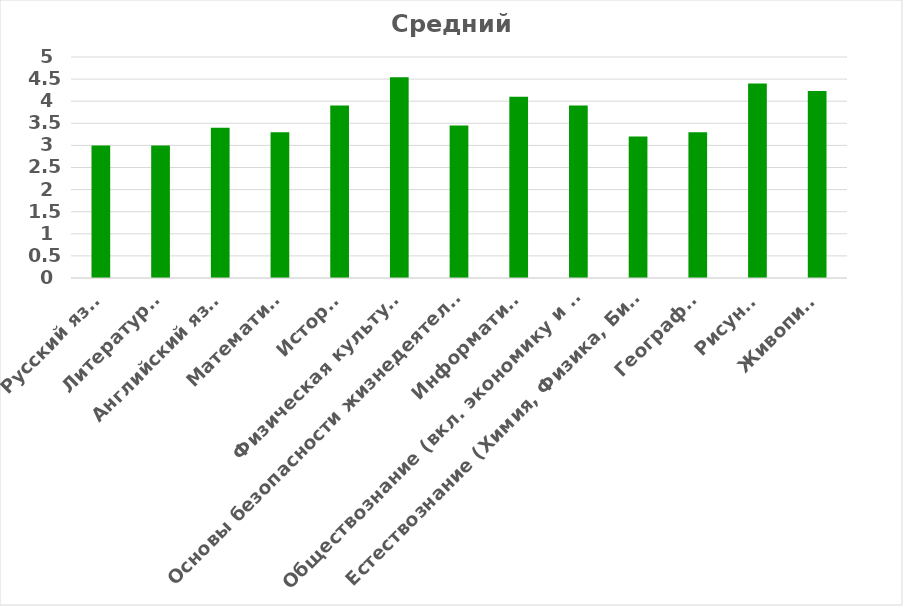
| Category | Средний балл |
|---|---|
|  Русский язык  | 3 |
| Литература  | 3 |
| Английский язык | 3.4 |
| Математика | 3.3 |
|  История | 3.9 |
| Физическая культура  | 4.54 |
| Основы безопасности жизнедеятельности (включая экологию) | 3.45 |
| Информатика | 4.1 |
| Обществознание (вкл. экономику и право) | 3.9 |
| Естествознание (Химия, Физика, Биология) | 3.2 |
| География | 3.3 |
|  Рисунок | 4.4 |
| Живопись | 4.23 |